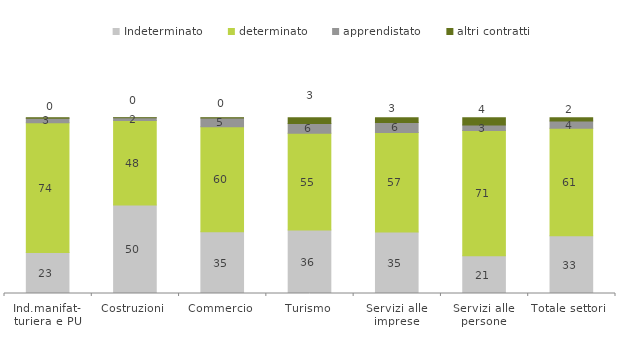
| Category | Indeterminato | determinato | apprendistato | altri contratti |
|---|---|---|---|---|
| Ind.manifat-
turiera e PU | 23.345 | 73.742 | 2.641 | 0.272 |
| Costruzioni | 50.36 | 48.039 | 1.52 | 0.08 |
| Commercio | 35.154 | 59.612 | 5.08 | 0.153 |
| Turismo | 36.167 | 55.034 | 5.536 | 3.264 |
| Servizi alle imprese | 35.025 | 56.569 | 5.725 | 2.68 |
| Servizi alle persone | 21.444 | 71.244 | 3.134 | 4.178 |
| Totale settori | 32.873 | 61.068 | 4.218 | 1.841 |